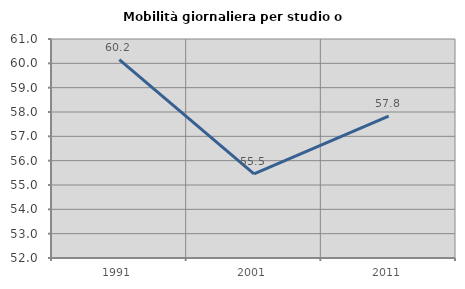
| Category | Mobilità giornaliera per studio o lavoro |
|---|---|
| 1991.0 | 60.156 |
| 2001.0 | 55.457 |
| 2011.0 | 57.828 |